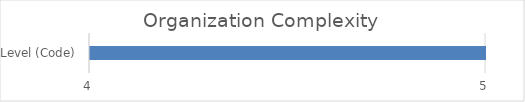
| Category | Organization Complexity level |
|---|---|
| Level (Code) | 5 |